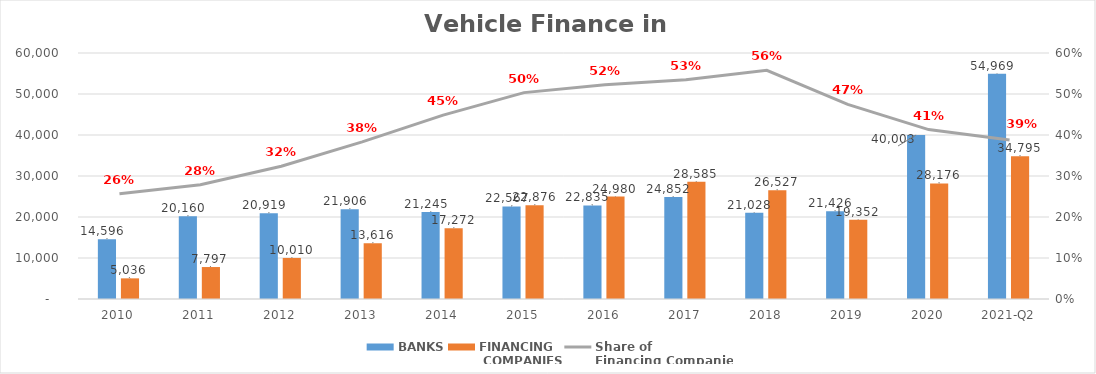
| Category | BANKS | FINANCING
 COMPANIES |
|---|---|---|
| 2010 | 14596 | 5035.89 |
| 2011 | 20160 | 7796.854 |
| 2012 | 20919 | 10009.755 |
| 2013 | 21906 | 13616.036 |
| 2014 | 21245 | 17271.844 |
| 2015 | 22567 | 22875.563 |
| 2016 | 22835 | 24980.231 |
| 2017 | 24852 | 28584.938 |
| 2018 | 21028 | 26527.133 |
| 2019 | 21426.2 | 19352.327 |
| 2020 | 40002.96 | 28176.3 |
| 2021-Q2 | 54969.15 | 34795.249 |